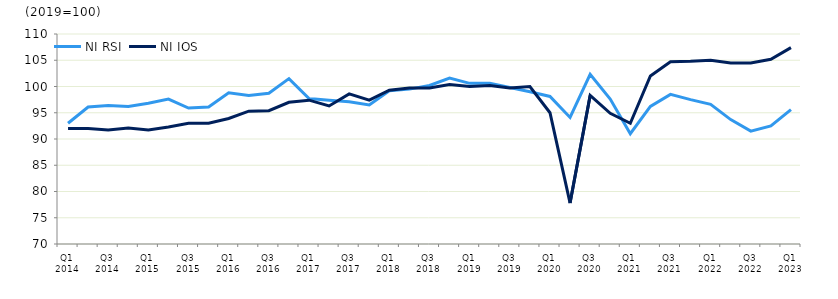
| Category | NI RSI | NI IOS |
|---|---|---|
| Q1 2014 | 93 | 92 |
|  | 96.1 | 92 |
| Q3 2014 | 96.4 | 91.7 |
|  | 96.2 | 92.1 |
| Q1 2015 | 96.8 | 91.7 |
|  | 97.6 | 92.3 |
| Q3 2015 | 95.9 | 93 |
|  | 96.1 | 93 |
| Q1 2016 | 98.8 | 93.9 |
|  | 98.3 | 95.3 |
| Q3 2016 | 98.7 | 95.4 |
|  | 101.5 | 97 |
| Q1 2017 | 97.7 | 97.4 |
|  | 97.4 | 96.3 |
| Q3 2017 | 97.1 | 98.6 |
|  | 96.5 | 97.4 |
| Q1 2018 | 99.2 | 99.3 |
|  | 99.5 | 99.7 |
| Q3 2018 | 100.2 | 99.7 |
|  | 101.6 | 100.4 |
| Q1 2019 | 100.6 | 100 |
|  | 100.6 | 100.2 |
| Q3 2019 | 99.8 | 99.7 |
|  | 99 | 100 |
| Q1 2020 | 98.1 | 95 |
|  | 94.1 | 77.8 |
| Q3 2020 | 102.3 | 98.3 |
|  | 97.6 | 94.9 |
| Q1 2021 | 91 | 93 |
|  | 96.2 | 102 |
| Q3 2021 | 98.5 | 104.7 |
|  | 97.5 | 104.8 |
| Q1 2022 | 96.6 | 105 |
|  | 93.7 | 104.5 |
| Q3 2022 | 91.5 | 104.5 |
|  | 92.5 | 105.2 |
| Q1 2023 | 95.6 | 107.4 |